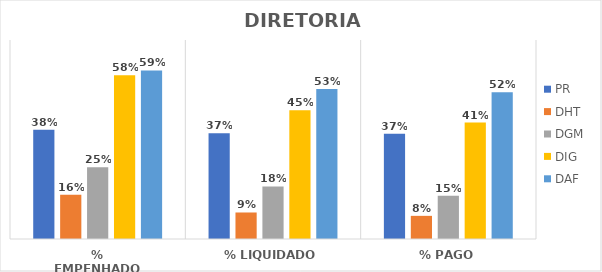
| Category | PR | DHT | DGM | DIG | DAF |
|---|---|---|---|---|---|
| % EMPENHADO | 0.384 | 0.155 | 0.252 | 0.576 | 0.593 |
| % LIQUIDADO | 0.372 | 0.093 | 0.185 | 0.453 | 0.528 |
| % PAGO | 0.37 | 0.081 | 0.152 | 0.41 | 0.516 |